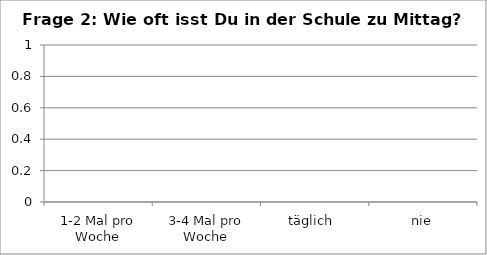
| Category | Series 0 |
|---|---|
| 1-2 Mal pro Woche | 0 |
| 3-4 Mal pro Woche | 0 |
| täglich  | 0 |
| nie | 0 |